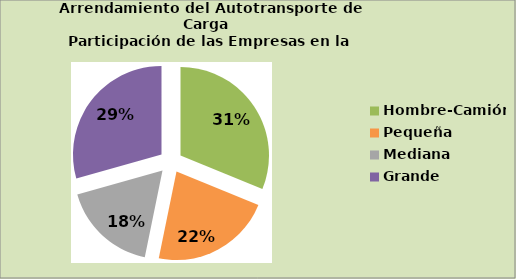
| Category | Series 0 |
|---|---|
| Hombre-Camión | 31.193 |
| Pequeña | 22.018 |
| Mediana | 17.431 |
| Grande | 29.358 |